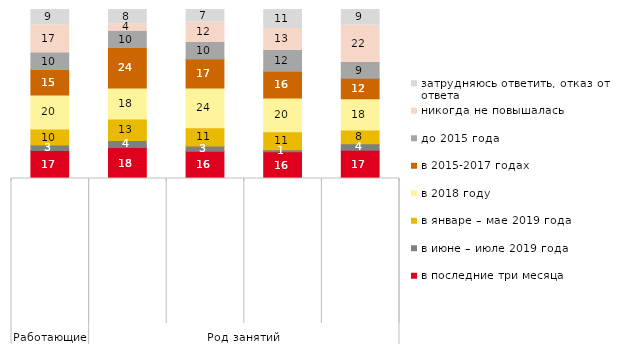
| Category | в последние три месяца | в июне – июле 2019 года | в январе – мае 2019 года | в 2018 году | в 2015-2017 годах | до 2015 года | никогда не повышалась | затрудняюсь ответить, отказ от ответа |
|---|---|---|---|---|---|---|---|---|
| 0 | 16.523 | 3.247 | 9.551 | 20.153 | 14.995 | 9.933 | 16.619 | 8.978 |
| 1 | 18.31 | 4.225 | 12.676 | 18.31 | 23.944 | 9.859 | 4.225 | 8.451 |
| 2 | 16.162 | 3.03 | 10.774 | 23.569 | 17.172 | 9.764 | 12.121 | 7.407 |
| 3 | 15.882 | 1.176 | 10.588 | 20 | 15.882 | 12.353 | 12.941 | 11.176 |
| 4 | 16.699 | 3.929 | 8.055 | 18.468 | 12.181 | 9.234 | 22.2 | 9.234 |